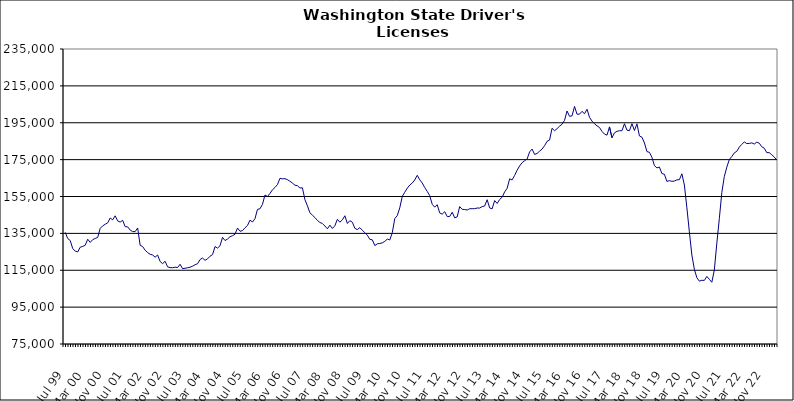
| Category | Series 0 |
|---|---|
| Jul 99 | 135560 |
| Aug 99 | 132182 |
| Sep 99 | 131104 |
| Oct 99 | 126694 |
| Nov 99 | 125425 |
| Dec 99 | 124927 |
| Jan 00 | 127499 |
| Feb 00 | 127927 |
| Mar 00 | 128547 |
| Apr 00 | 131834 |
| May 00 | 130120 |
| Jun 00 | 131595 |
| Jul 00 | 132236 |
| Aug 00 | 132819 |
| Sep 00 | 137711 |
| Oct 00 | 139063 |
| Nov 00 | 139952 |
| Dec 00 | 140732 |
| Jan 01 | 143338 |
| Feb 01 | 142359 |
| Mar 01 | 144523 |
| Apr 01 | 141758 |
| May 01 | 141135 |
| Jun 01 | 142064 |
| Jul 01 | 138646 |
| Aug 01 | 138530 |
| Sep 01 | 136784 |
| Oct 01 | 135996 |
| Nov 01 | 135917 |
| Dec 01 | 137940 |
| Jan 02 | 128531 |
| Feb 02 | 127848 |
| Mar 02 | 125876 |
| Apr 02 | 124595 |
| May 02 | 123660 |
| Jun 02 | 123282 |
| Jul 02 | 122089 |
| Aug 02 | 123279 |
| Sep 02 | 119727 |
| Oct 02 | 118588 |
| Nov 02 | 119854 |
| Dec 02 | 116851 |
| Jan 03 | 116407 |
| Feb 03 | 116382 |
| Mar 03 | 116648 |
| Apr 03 | 116471 |
| May 03 | 118231 |
| Jun 03 | 115831 |
| Jul 03 | 116082 |
| Aug 03 | 116341 |
| Sep 03 | 116653 |
| Oct 03 | 117212 |
| Nov 03 | 117962 |
| Dec 03 | 118542 |
| Jan 04 | 120817 |
| Feb 04 | 121617 |
| Mar 04 | 120369 |
| Apr 04 | 121200 |
| May 04 | 122609 |
| Jun 04 | 123484 |
| Jul 04 | 127844 |
| Aug 04 | 127025 |
| Sep 04 | 128273 |
| Oct 04 | 132853 |
| Nov 04 | 131106 |
| Dec 04 | 131935 |
| Jan 05 | 133205 |
| Feb 05 | 133736 |
| Mar 05 | 134528 |
| Apr 05 | 137889 |
| May 05 | 136130 |
| Jun 05 | 136523 |
| Jul 05 | 137997 |
| Aug 05 | 139294 |
| Sep 05 | 142140 |
| Oct 05 | 141192 |
| Nov 05 | 142937 |
| Dec 05 | 148013 |
| Jan 06 | 148341 |
| Feb 06 | 150744 |
| Mar 06 | 155794 |
| Apr 06 | 154984 |
| May 06 | 156651 |
| Jun 06 | 158638 |
| Jul 06 | 159911 |
| Aug 06 | 161445 |
| Sep 06 | 164852 |
| Oct 06 | 164570 |
| Nov 06 | 164679 |
| Dec 06 | 164127 |
| Jan 07 | 163271 |
| Feb 07 | 162273 |
| Mar 07 | 161140 |
| Apr 07 | 160860 |
| May 07 | 159633 |
| Jun 07 | 159724 |
| Jul 07 | 153303 |
| Aug 07 | 149939 |
| Sep 07 | 146172 |
| Oct 07 | 144876 |
| Nov 07 | 143613 |
| Dec 07 | 142022 |
| Jan 08 | 140909 |
| Feb 08 | 140368 |
| Mar 08 | 138998 |
| Apr 08 | 137471 |
| May 08 | 139453 |
| Jun 08 | 137680 |
| Jul 08 | 139120 |
| Aug 08 | 142612 |
| Sep-08 | 141071 |
| Oct 08 | 142313 |
| Nov 08 | 144556 |
| Dec 08 | 140394 |
| Jan 09 | 141903 |
| Feb 09 | 141036 |
| Mar 09 | 137751 |
| Apr 09 | 137060 |
| May 09 | 138101 |
| Jun 09 | 136739 |
| Jul 09 | 135317 |
| Aug 09 | 134020 |
| Sep 09 | 131756 |
| Oct 09 | 131488 |
| Nov 09 | 128370 |
| Dec 09 | 129323 |
| Jan 10 | 129531 |
| Feb 10 | 129848 |
| Mar 10 | 130654 |
| Apr 10 | 131929 |
| May 10 | 131429 |
| Jun 10 | 135357 |
| Jul 10 | 143032 |
| Aug 10 | 144686 |
| Sep 10 | 148856 |
| Oct 10 | 155042 |
| Nov 10 | 157328 |
| Dec 10 | 159501 |
| Jan 11 | 161221 |
| Feb 11 | 162312 |
| Mar 11 | 163996 |
| Apr 11 | 166495 |
| May 11 | 164040 |
| Jun 11 | 162324 |
| Jul 11 | 159862 |
| Aug 11 | 157738 |
| Sep 11 | 155430 |
| Oct 11 | 150762 |
| Nov 11 | 149255 |
| Dec 11 | 150533 |
| Jan 12 | 146068 |
| Feb 12 | 145446 |
| Mar 12 | 146788 |
| Apr 12 | 144110 |
| May 12 | 144162 |
| Jun 12 | 146482 |
| Jul 12 | 143445 |
| Aug 12 | 143950 |
| Sep 12 | 149520 |
| Oct 12 | 148033 |
| Nov 12 | 147926 |
| Dec 12 | 147674 |
| Jan 13 | 148360 |
| Feb-13 | 148388 |
| Mar-13 | 148414 |
| Apr 13 | 148749 |
| May 13 | 148735 |
| Jun-13 | 149521 |
| Jul 13 | 149837 |
| Aug 13 | 153252 |
| Sep 13 | 148803 |
| Oct 13 | 148315 |
| Nov 13 | 152804 |
| Dec 13 | 151209 |
| Jan 14 | 153357 |
| Feb-14 | 154608 |
| Mar 14 | 157479 |
| Apr 14 | 159441 |
| May 14 | 164591 |
| Jun 14 | 163995 |
| Jul-14 | 166411 |
| Aug-14 | 169272 |
| Sep 14 | 171565 |
| Oct 14 | 173335 |
| Nov 14 | 174406 |
| Dec 14 | 175302 |
| Jan 15 | 179204 |
| Feb 15 | 180737 |
| Mar 15 | 177810 |
| Apr-15 | 178331 |
| May 15 | 179601 |
| Jun-15 | 180729 |
| Jul 15 | 182540 |
| Aug 15 | 184924 |
| Sep 15 | 185620 |
| Oct 15 | 192002 |
| Nov 15 | 190681 |
| Dec 15 | 191795 |
| Jan 16 | 193132 |
| Feb 16 | 194206 |
| Mar 16 | 196319 |
| Apr 16 | 201373 |
| May 16 | 198500 |
| Jun 16 | 198743 |
| Jul 16 | 203841 |
| Aug 16 | 199630 |
| Sep 16 | 199655 |
| Oct 16 | 201181 |
| Nov 16 | 199888 |
| Dec 16 | 202304 |
| Jan 17 | 197977 |
| Feb 17 | 195889 |
| Mar 17 | 194438 |
| Apr 17 | 193335 |
| May 17 | 192430 |
| Jun 17 | 190298 |
| Jul 17 | 188832 |
| Aug 17 | 188264 |
| Sep 17 | 192738 |
| Oct 17 | 186856 |
| Nov 17 | 189537 |
| Dec 17 | 190341 |
| Jan 18 | 190670 |
| Feb 18 | 190645 |
| Mar 18 | 194476 |
| Apr 18 | 190971 |
| May 18 | 190707 |
| Jun 18 | 194516 |
| Jul 18 | 190783 |
| Aug 18 | 194390 |
| Sep 18 | 187831 |
| Oct 18 | 187188 |
| Nov 18 | 184054 |
| Dec 18 | 179347 |
| Jan 19 | 178958 |
| Feb 19 | 176289 |
| Mar 19 | 171747 |
| Apr 19 | 170532 |
| May 19 | 170967 |
| Jun 19 | 167444 |
| Jul 19 | 167059 |
| Aug 19 | 163194 |
| Sep 19 | 163599 |
| Oct 19 | 163212 |
| Nov 19 | 163388 |
| Dec 19 | 164024 |
| Jan 20 | 164114 |
| Feb 20 | 167320 |
| Mar 20 | 161221 |
| Apr 20 | 148866 |
| May 20 | 135821 |
| Jun 20 | 123252 |
| Jul 20 | 115526 |
| Aug 20 | 110940 |
| Sep 20 | 109099 |
| Oct 20 | 109566 |
| Nov 20 | 109488 |
| Dec 20 | 111658 |
| Jan 21 | 110070 |
| Feb 21 | 108491 |
| Mar 21 | 115176 |
| Apr 21 | 129726 |
| May 21 | 143052 |
| Jun 21 | 157253 |
| Jul 21 | 165832 |
| Aug 21 | 170937 |
| Sep 21 | 175042 |
| Oct 21 | 176696 |
| Nov 21 | 178677 |
| Dec 21 | 179501 |
| Jan 22 | 181825 |
| Feb 22 | 183258 |
| Mar 22 | 184618 |
| Apr 22 | 183710 |
| May 22 | 183784 |
| Jun 22 | 184101 |
| Jul 22 | 183443 |
| Aug 22 | 184475 |
| Sep 22 | 183902 |
| Oct 22 | 181994 |
| Nov 22 | 181207 |
| Dec 22 | 178793 |
| Jan 23 | 178782 |
| Feb 23 | 177647 |
| Mar 23 | 176386 |
| Apr 23 | 174729 |